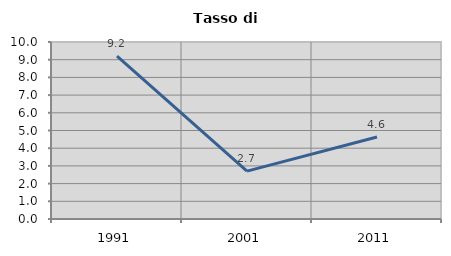
| Category | Tasso di disoccupazione   |
|---|---|
| 1991.0 | 9.195 |
| 2001.0 | 2.706 |
| 2011.0 | 4.637 |